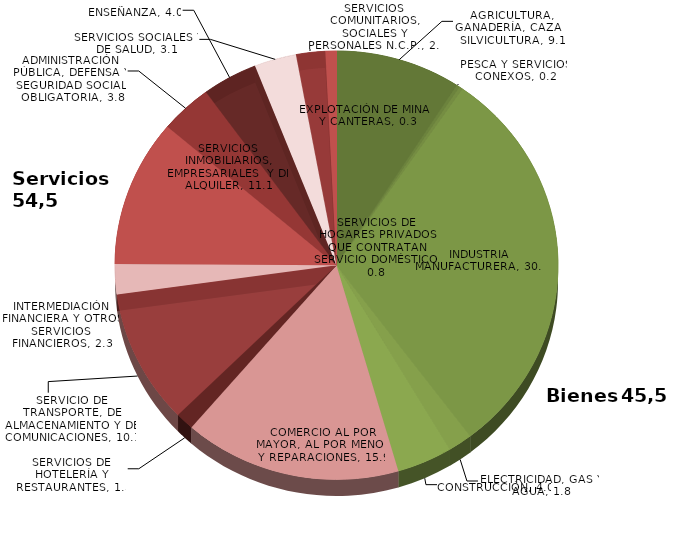
| Category | Series 0 |
|---|---|
| 0 | 9.13 |
| 1 | 0.228 |
| 2 | 0.256 |
| 3 | 30.077 |
| 4 | 1.764 |
| 5 | 4.046 |
| 6 | 15.852 |
| 7 | 1.326 |
| 8 | 10.143 |
| 9 | 2.269 |
| 10 | 11.098 |
| 11 | 3.78 |
| 12 | 4.04 |
| 13 | 3.056 |
| 14 | 2.133 |
| 15 | 0.803 |